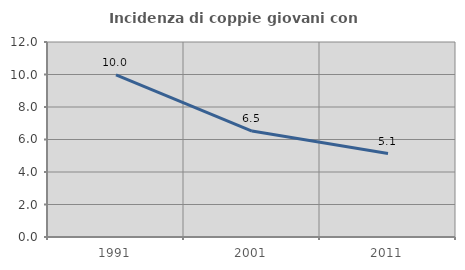
| Category | Incidenza di coppie giovani con figli |
|---|---|
| 1991.0 | 9.976 |
| 2001.0 | 6.52 |
| 2011.0 | 5.135 |